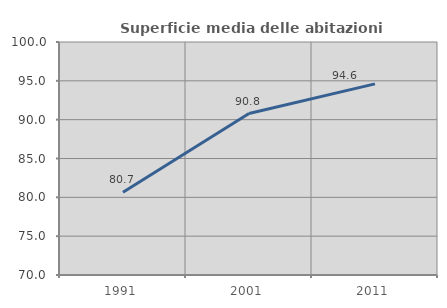
| Category | Superficie media delle abitazioni occupate |
|---|---|
| 1991.0 | 80.65 |
| 2001.0 | 90.792 |
| 2011.0 | 94.606 |